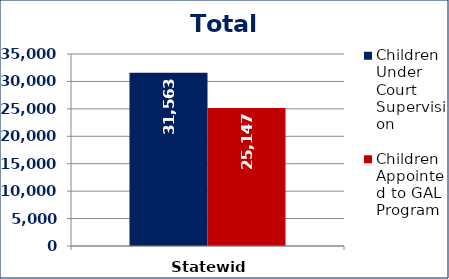
| Category | Children Under Court Supervision  | Children Appointed to GAL Program  |
|---|---|---|
| Statewide | 31563 | 25147 |